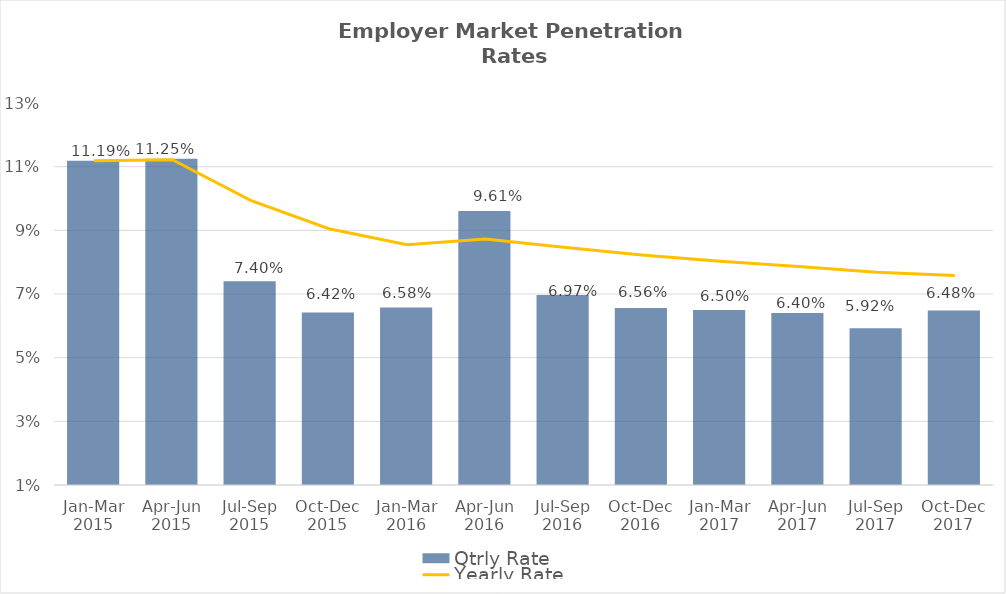
| Category | Qtrly Rate |
|---|---|
| Jan-Mar 2015 | 0.112 |
| Apr-Jun 2015 | 0.112 |
| Jul-Sep 2015 | 0.074 |
| Oct-Dec 2015 | 0.064 |
| Jan-Mar 2016 | 0.066 |
| Apr-Jun 2016 | 0.096 |
| Jul-Sep 2016 | 0.07 |
| Oct-Dec 2016 | 0.066 |
| Jan-Mar 2017 | 0.065 |
| Apr-Jun 2017 | 0.064 |
| Jul-Sep 2017 | 0.059 |
| Oct-Dec 2017 | 0.065 |